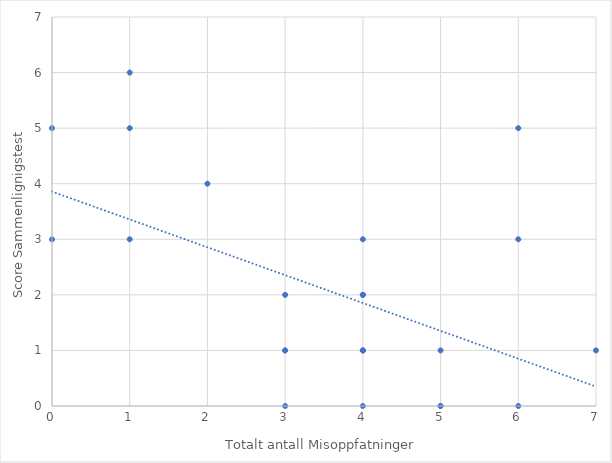
| Category | Series 0 |
|---|---|
| 4.0 | 0 |
| 1.0 | 3 |
| 3.0 | 1 |
| 0.0 | 3 |
| 1.0 | 5 |
| 4.0 | 1 |
| 6.0 | 0 |
| 6.0 | 5 |
| 6.0 | 3 |
| 5.0 | 1 |
| 3.0 | 2 |
| 2.0 | 4 |
| 3.0 | 0 |
| 1.0 | 6 |
| 0.0 | 5 |
| 5.0 | 0 |
| 4.0 | 2 |
| 4.0 | 3 |
| 4.0 | 2 |
| 3.0 | 1 |
| 4.0 | 1 |
| 4.0 | 1 |
| 5.0 | 0 |
| 7.0 | 1 |